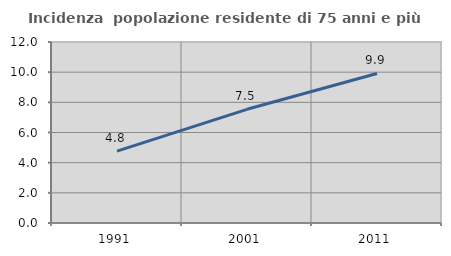
| Category | Incidenza  popolazione residente di 75 anni e più |
|---|---|
| 1991.0 | 4.767 |
| 2001.0 | 7.537 |
| 2011.0 | 9.914 |